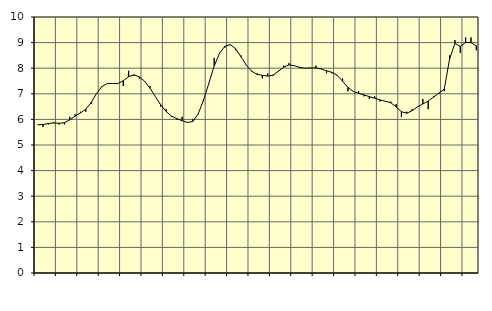
| Category | Piggar | Series 1 |
|---|---|---|
| nan | 5.8 | 5.79 |
| 1.0 | 5.7 | 5.8 |
| 1.0 | 5.8 | 5.84 |
| 1.0 | 5.9 | 5.86 |
| nan | 5.8 | 5.85 |
| 2.0 | 5.8 | 5.87 |
| 2.0 | 6.1 | 5.98 |
| 2.0 | 6.2 | 6.13 |
| nan | 6.3 | 6.25 |
| 3.0 | 6.3 | 6.4 |
| 3.0 | 6.6 | 6.66 |
| 3.0 | 7 | 7.01 |
| nan | 7.3 | 7.28 |
| 4.0 | 7.4 | 7.4 |
| 4.0 | 7.4 | 7.4 |
| 4.0 | 7.4 | 7.4 |
| nan | 7.3 | 7.51 |
| 5.0 | 7.9 | 7.67 |
| 5.0 | 7.7 | 7.74 |
| 5.0 | 7.6 | 7.66 |
| nan | 7.5 | 7.49 |
| 6.0 | 7.3 | 7.22 |
| 6.0 | 6.9 | 6.89 |
| 6.0 | 6.5 | 6.57 |
| nan | 6.4 | 6.31 |
| 7.0 | 6.1 | 6.13 |
| 7.0 | 6 | 6.03 |
| 7.0 | 6.1 | 5.95 |
| nan | 5.9 | 5.88 |
| 8.0 | 6 | 5.92 |
| 8.0 | 6.2 | 6.21 |
| 8.0 | 6.7 | 6.75 |
| nan | 7.4 | 7.41 |
| 9.0 | 8.4 | 8.09 |
| 9.0 | 8.6 | 8.58 |
| 9.0 | 8.8 | 8.86 |
| nan | 8.9 | 8.92 |
| 10.0 | 8.7 | 8.76 |
| 10.0 | 8.5 | 8.45 |
| 10.0 | 8.1 | 8.12 |
| nan | 7.9 | 7.88 |
| 11.0 | 7.8 | 7.76 |
| 11.0 | 7.6 | 7.72 |
| 11.0 | 7.8 | 7.69 |
| nan | 7.7 | 7.73 |
| 12.0 | 7.9 | 7.88 |
| 12.0 | 8.1 | 8.04 |
| 12.0 | 8.2 | 8.13 |
| nan | 8.1 | 8.1 |
| 13.0 | 8 | 8.03 |
| 13.0 | 8 | 8 |
| 13.0 | 8 | 8.01 |
| nan | 8.1 | 8.01 |
| 14.0 | 8 | 7.97 |
| 14.0 | 7.8 | 7.9 |
| 14.0 | 7.8 | 7.84 |
| nan | 7.7 | 7.72 |
| 15.0 | 7.6 | 7.49 |
| 15.0 | 7.1 | 7.25 |
| 15.0 | 7.1 | 7.09 |
| nan | 7.1 | 7.02 |
| 16.0 | 6.9 | 6.96 |
| 16.0 | 6.8 | 6.89 |
| 16.0 | 6.9 | 6.83 |
| nan | 6.7 | 6.76 |
| 17.0 | 6.7 | 6.71 |
| 17.0 | 6.7 | 6.65 |
| 17.0 | 6.6 | 6.49 |
| nan | 6.1 | 6.3 |
| 18.0 | 6.3 | 6.24 |
| 18.0 | 6.4 | 6.34 |
| 18.0 | 6.5 | 6.49 |
| nan | 6.8 | 6.6 |
| 19.0 | 6.4 | 6.72 |
| 19.0 | 6.9 | 6.87 |
| 19.0 | 7 | 7.03 |
| nan | 7.1 | 7.18 |
| 20.0 | 8.5 | 8.36 |
| 20.0 | 9.1 | 8.97 |
| 20.0 | 8.6 | 8.85 |
| nan | 9.2 | 9.01 |
| 21.0 | 9.2 | 9 |
| 21.0 | 8.7 | 8.87 |